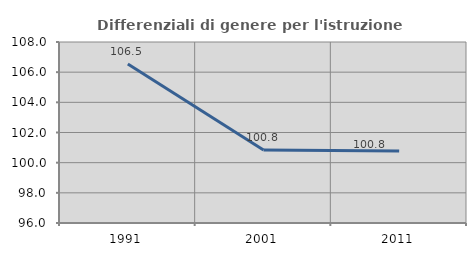
| Category | Differenziali di genere per l'istruzione superiore |
|---|---|
| 1991.0 | 106.545 |
| 2001.0 | 100.834 |
| 2011.0 | 100.768 |